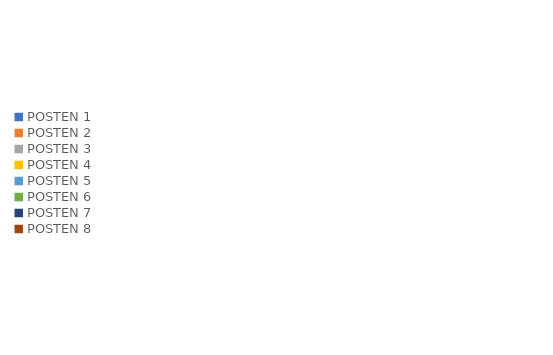
| Category | Series 0 | Series 1 |
|---|---|---|
| POSTEN 1 | 0 | 0 |
| POSTEN 2 | 0 | 0 |
| POSTEN 3 | 0 | 0 |
| POSTEN 4 | 0 | 0 |
| POSTEN 5 | 0 | 0 |
| POSTEN 6 | 0 | 0 |
| POSTEN 7 | 0 | 0 |
| POSTEN 8 | 0 | 0 |